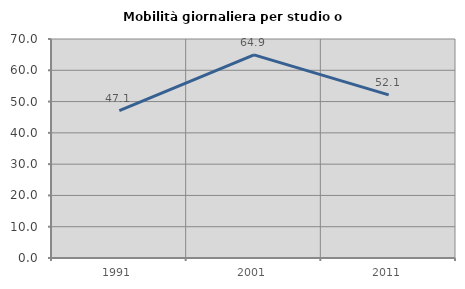
| Category | Mobilità giornaliera per studio o lavoro |
|---|---|
| 1991.0 | 47.126 |
| 2001.0 | 64.935 |
| 2011.0 | 52.128 |